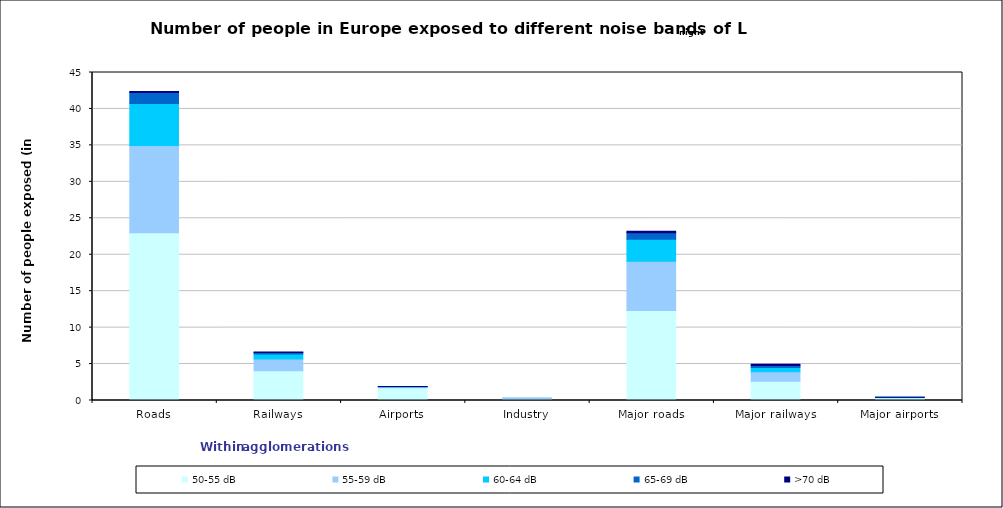
| Category | 50-55 dB | 55-59 dB | 60-64 dB | 65-69 dB | >70 dB |
|---|---|---|---|---|---|
| Roads | 23019100 | 11950300 | 5781900 | 1509500 | 138900 |
| Railways | 4095500 | 1606600 | 671300 | 200600 | 63500 |
| Airports | 1736998 | 132400 | 30900 | 5200 | 3100 |
| Industry | 251200 | 110300 | 0 | 0 | 0 |
| Major roads | 12353857 | 6764757 | 3007957 | 881257 | 203857 |
| Major railways | 2642700 | 1307000 | 575800 | 279300 | 164700 |
| Major airports | 368400 | 56900 | 7500 | 800 | 500 |